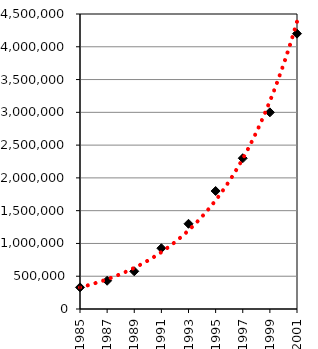
| Category | Series 0 |
|---|---|
| 1985.0 | 330000 |
| 1987.0 | 431000 |
| 1989.0 | 575000 |
| 1991.0 | 927000 |
| 1993.0 | 1300000 |
| 1995.0 | 1800000 |
| 1997.0 | 2300000 |
| 1999.0 | 3000000 |
| 2001.0 | 4200000 |